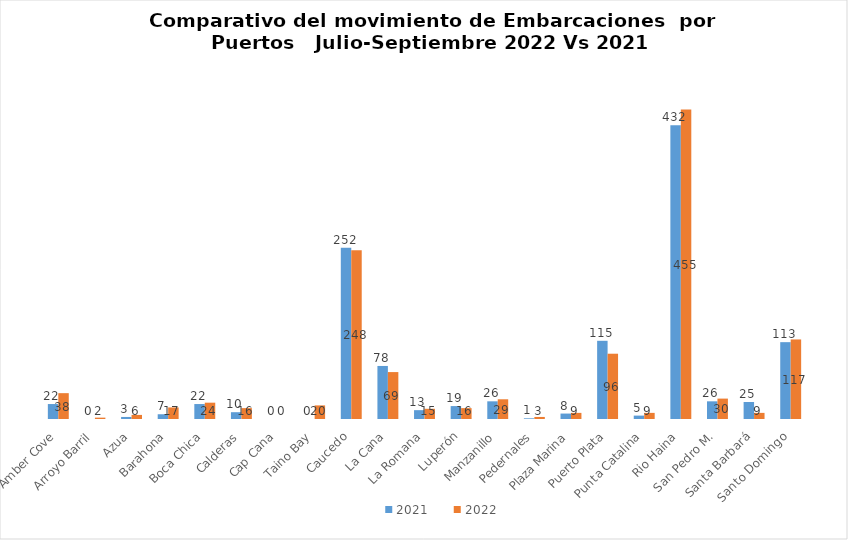
| Category | 2021 | 2022 |
|---|---|---|
| Amber Cove | 22 | 38 |
| Arroyo Barril | 0 | 2 |
| Azua | 3 | 6 |
| Barahona | 7 | 17 |
| Boca Chica | 22 | 24 |
| Calderas | 10 | 16 |
| Cap Cana | 0 | 0 |
| Taino Bay | 0 | 20 |
| Caucedo | 252 | 248 |
| La Cana | 78 | 69 |
| La Romana | 13 | 15 |
| Luperón | 19 | 16 |
| Manzanillo | 26 | 29 |
| Pedernales | 1 | 3 |
| Plaza Marina | 8 | 9 |
| Puerto Plata | 115 | 96 |
| Punta Catalina | 5 | 9 |
| Rio Haina | 432 | 455 |
| San Pedro M. | 26 | 30 |
| Santa Barbará | 25 | 9 |
| Santo Domingo | 113 | 117 |